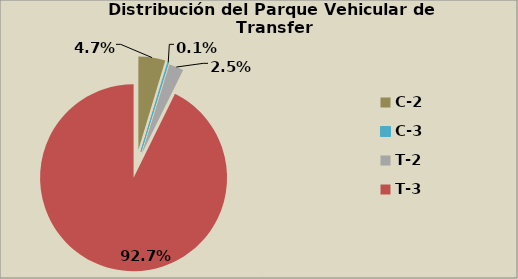
| Category | Series 0 |
|---|---|
| C-2 | 4.65 |
| C-3  | 0.129 |
| T-2 | 2.524 |
| T-3 | 92.696 |